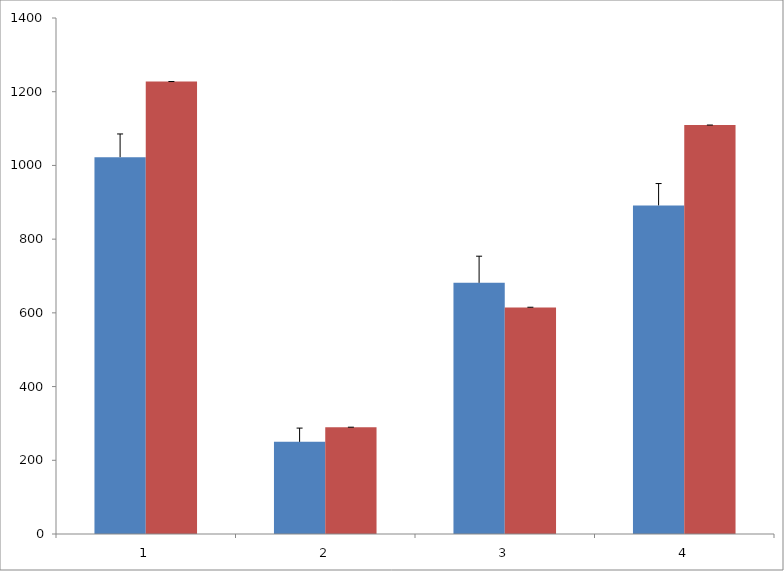
| Category | Series 0 | Series 1 |
|---|---|---|
| 0 | 1022.52 | 1227.485 |
| 1 | 250.028 | 289.452 |
| 2 | 681.488 | 614.761 |
| 3 | 891.589 | 1109.568 |